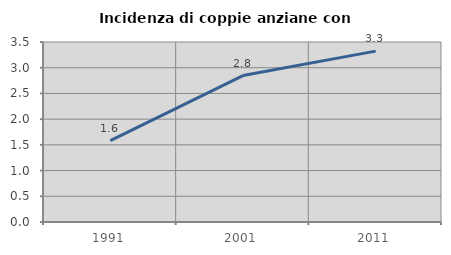
| Category | Incidenza di coppie anziane con figli |
|---|---|
| 1991.0 | 1.581 |
| 2001.0 | 2.847 |
| 2011.0 | 3.322 |